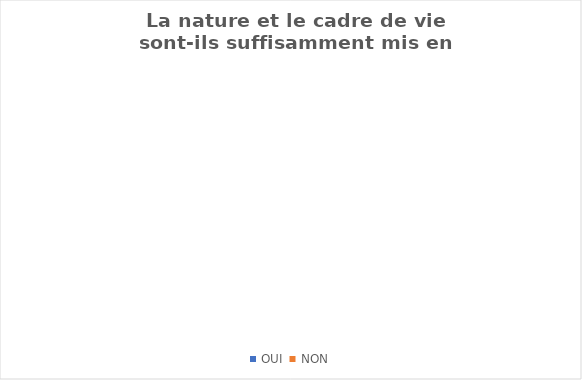
| Category | Series 0 |
|---|---|
| OUI  | 0 |
| NON | 0 |